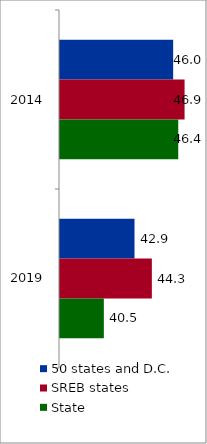
| Category | 50 states and D.C. | SREB states | State |
|---|---|---|---|
| 2014.0 | 46.021 | 46.93 | 46.425 |
| 2019.0 | 42.938 | 44.322 | 40.494 |